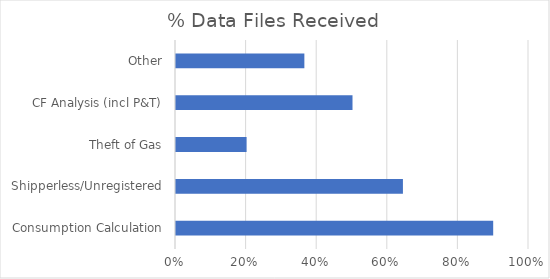
| Category | % Data Received |
|---|---|
| Consumption Calculation | 0.899 |
| Shipperless/Unregistered | 0.643 |
| Theft of Gas | 0.2 |
| CF Analysis (incl P&T) | 0.5 |
| Other | 0.364 |